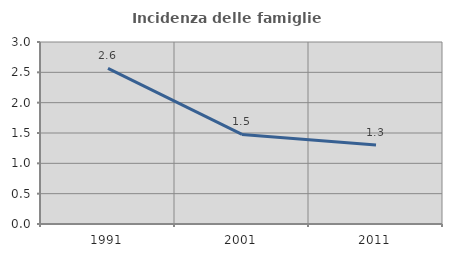
| Category | Incidenza delle famiglie numerose |
|---|---|
| 1991.0 | 2.564 |
| 2001.0 | 1.477 |
| 2011.0 | 1.302 |